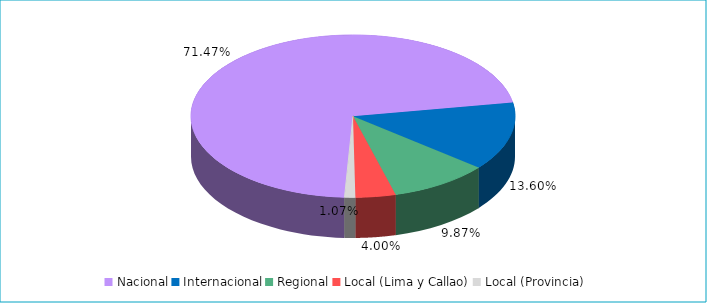
| Category | Series 0 |
|---|---|
| Nacional | 0.715 |
| Internacional | 0.136 |
| Regional | 0.099 |
| Local (Lima y Callao) | 0.04 |
| Local (Provincia) | 0.011 |